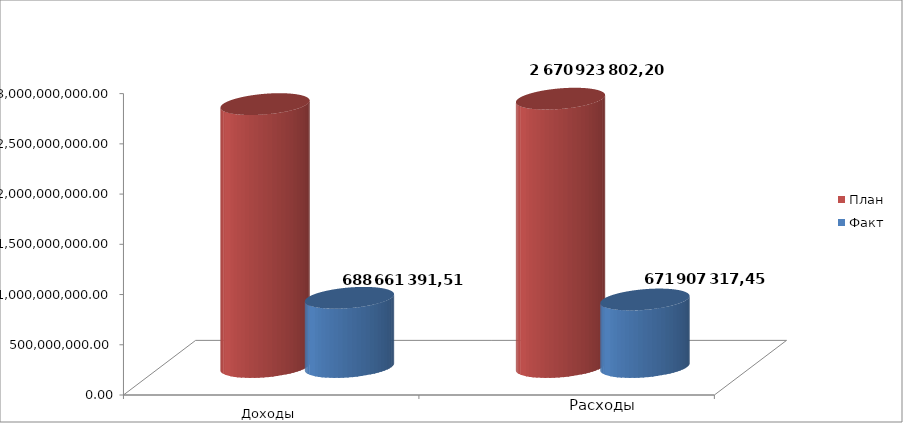
| Category | План | Факт |
|---|---|---|
| 0 | 2616867760.22 | 688661391.51 |
| 1 | 2670923802.2 | 671907317.45 |